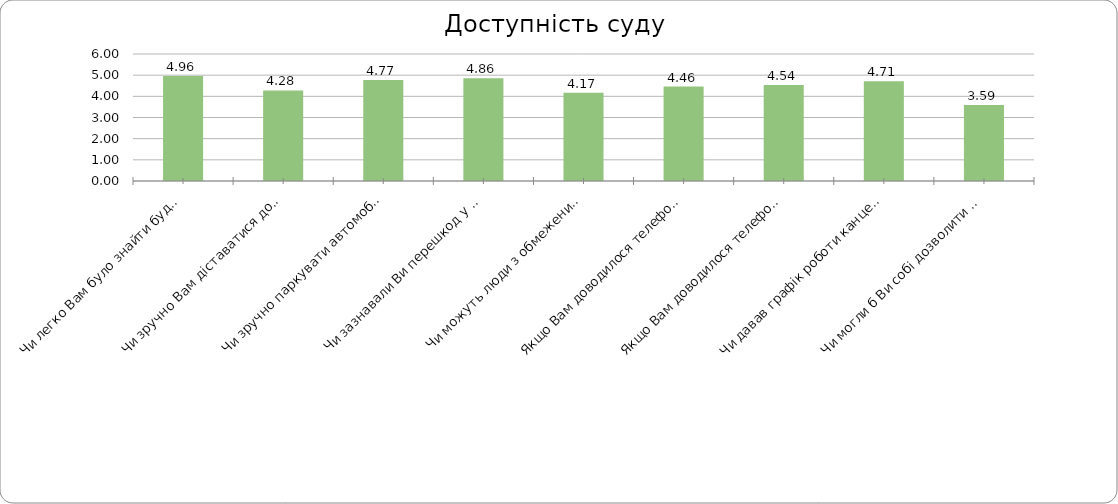
| Category | Series 0 |
|---|---|
| Чи легко Вам було знайти будівлю суду? | 4.964 |
| Чи зручно Вам діставатися до будівлі суду громадським транспортом? | 4.278 |
| Чи зручно паркувати автомобіль (достатньо паркувальних місць) біля будівлі суду? | 4.773 |
| Чи зазнавали Ви перешкод у доступі до приміщень суду через охорону? | 4.857 |
| Чи можуть люди з обмеженими можливостями безперешкодно потрапити до приміщення суду і користуватися послугами суду? | 4.172 |
| Якщо Вам доводилося телефонувати до суду, чи завжди вдавалось додзвонитися? | 4.462 |
| Якщо Вам доводилося телефонувати до суду, чи завжди вдавалось отримати потрібну інформацію? | 4.538 |
| Чи давав графік роботи канцелярії суду можливість вчасно та безперешкодно вирішувати Ваші справи у суді | 4.714 |
| Чи могли б Ви собі дозволити витрати на послуги адвоката у разі необхідності? | 3.591 |